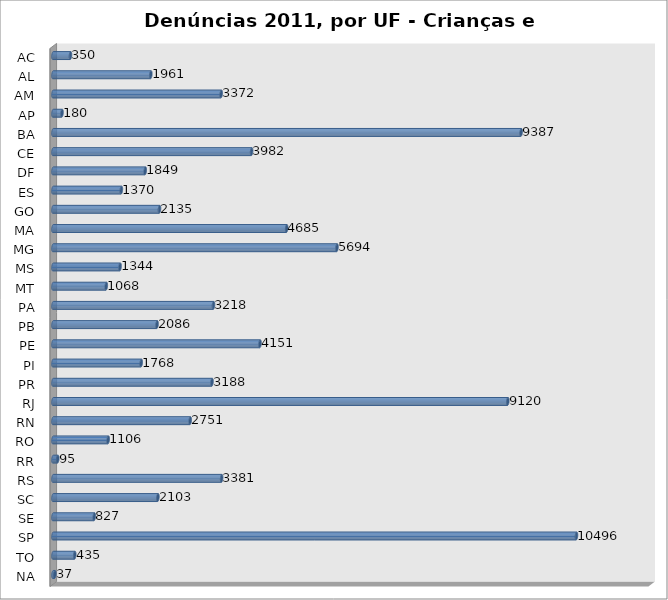
| Category | Series 0 |
|---|---|
| AC | 350 |
| AL | 1961 |
| AM | 3372 |
| AP | 180 |
| BA | 9387 |
| CE | 3982 |
| DF | 1849 |
| ES | 1370 |
| GO | 2135 |
| MA | 4685 |
| MG | 5694 |
| MS | 1344 |
| MT | 1068 |
| PA | 3218 |
| PB | 2086 |
| PE | 4151 |
| PI | 1768 |
| PR | 3188 |
| RJ | 9120 |
| RN | 2751 |
| RO | 1106 |
| RR | 95 |
| RS | 3381 |
| SC | 2103 |
| SE | 827 |
| SP | 10496 |
| TO | 435 |
| NA | 37 |